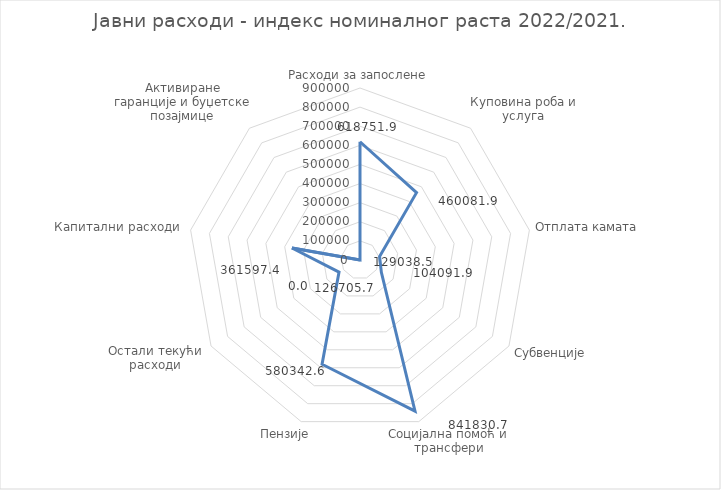
| Category | Series 0 |
|---|---|
| Расходи за запослене | 618751.914 |
| Куповина роба и услуга | 460081.92 |
| Отплата камата | 104091.923 |
| Субвенције | 129038.54 |
| Социјална помоћ и трансфери | 841830.749 |
| Пензије | 580342.56 |
| Остали текући расходи | 126705.717 |
| Капитални расходи | 361597.404 |
| Активиране гаранције и буџетске позајмице | 0 |